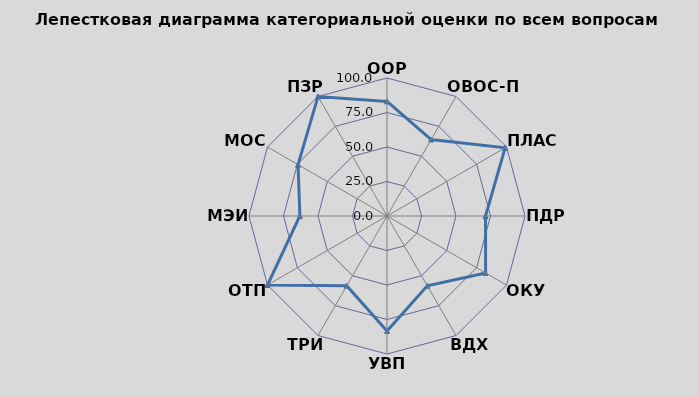
| Category | B |
|---|---|
| ООР | 83.036 |
| ОВОС-ПЗ | 64 |
| ПЛАС | 98.828 |
| ПДР | 71.397 |
| ОКУ | 82.5 |
| ВДХ | 58.393 |
| УВП | 83.333 |
| ТРИ | 58.333 |
| ОТП | 100 |
| МЭИ | 63.141 |
| MОС | 74.432 |
| ПЗР | 100 |